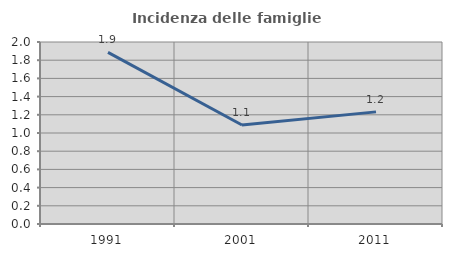
| Category | Incidenza delle famiglie numerose |
|---|---|
| 1991.0 | 1.886 |
| 2001.0 | 1.088 |
| 2011.0 | 1.232 |